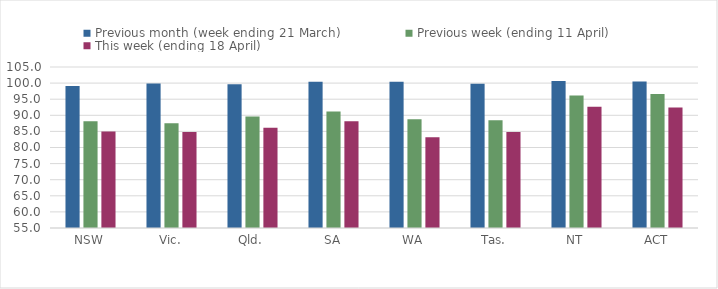
| Category | Previous month (week ending 21 March) | Previous week (ending 11 April) | This week (ending 18 April) |
|---|---|---|---|
| NSW | 99.097 | 88.124 | 84.972 |
| Vic. | 99.884 | 87.515 | 84.827 |
| Qld. | 99.661 | 89.648 | 86.129 |
| SA | 100.41 | 91.206 | 88.147 |
| WA | 100.439 | 88.811 | 83.177 |
| Tas. | 99.78 | 88.439 | 84.812 |
| NT | 100.626 | 96.157 | 92.642 |
| ACT | 100.535 | 96.629 | 92.407 |